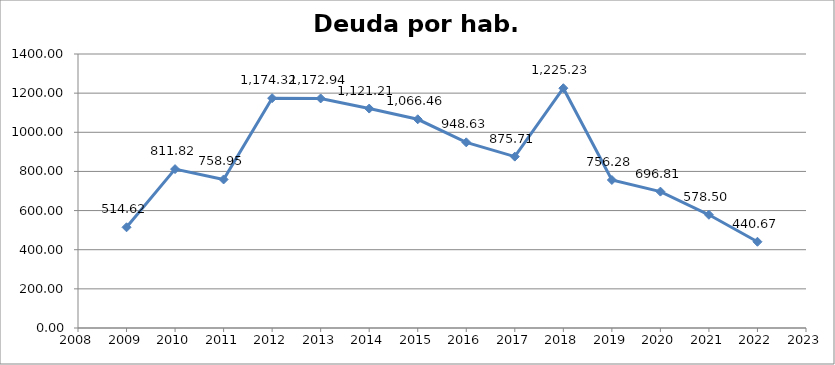
| Category | Deuda por hab. (€/hab.) |
|---|---|
| 2009.0 | 514.62 |
| 2010.0 | 811.823 |
| 2011.0 | 758.955 |
| 2012.0 | 1174.32 |
| 2013.0 | 1172.94 |
| 2014.0 | 1121.209 |
| 2015.0 | 1066.459 |
| 2016.0 | 948.632 |
| 2017.0 | 875.706 |
| 2018.0 | 1225.226 |
| 2019.0 | 756.281 |
| 2020.0 | 696.81 |
| 2021.0 | 578.504 |
| 2022.0 | 440.671 |